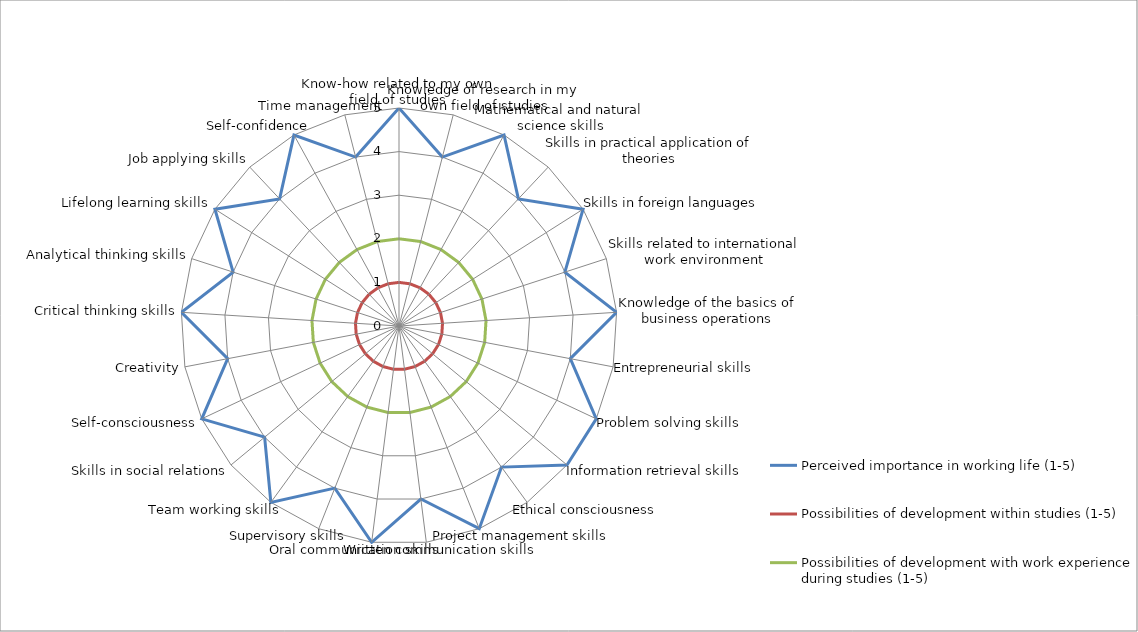
| Category | Perceived importance in working life (1-5) | Possibilities of development within studies (1-5) | Possibilities of development with work experience during studies (1-5) |
|---|---|---|---|
| Know-how related to my own field of studies | 5 | 1 | 2 |
| Knowledge of research in my own field of studies | 4 | 1 | 2 |
| Mathematical and natural science skills | 5 | 1 | 2 |
| Skills in practical application of theories | 4 | 1 | 2 |
| Skills in foreign languages | 5 | 1 | 2 |
| Skills related to international work environment | 4 | 1 | 2 |
| Knowledge of the basics of business operations | 5 | 1 | 2 |
| Entrepreneurial skills | 4 | 1 | 2 |
| Problem solving skills | 5 | 1 | 2 |
| Information retrieval skills | 5 | 1 | 2 |
| Ethical consciousness | 4 | 1 | 2 |
| Project management skills | 5 | 1 | 2 |
| Written communication skills | 4 | 1 | 2 |
| Oral communication skills | 5 | 1 | 2 |
| Supervisory skills | 4 | 1 | 2 |
| Team working skills | 5 | 1 | 2 |
| Skills in social relations | 4 | 1 | 2 |
| Self-consciousness | 5 | 1 | 2 |
| Creativity | 4 | 1 | 2 |
| Critical thinking skills | 5 | 1 | 2 |
| Analytical thinking skills | 4 | 1 | 2 |
| Lifelong learning skills | 5 | 1 | 2 |
| Job applying skills | 4 | 1 | 2 |
| Self-confidence | 5 | 1 | 2 |
| Time management | 4 | 1 | 2 |